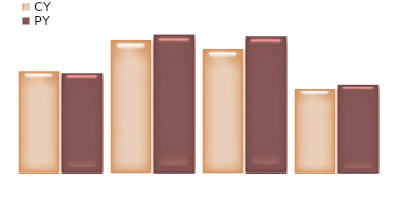
| Category | CY | PY |
|---|---|---|
| Road | 5596205.624 | 5484281.512 |
| Courier | 7299398.641 | 7591374.586 |
| Air | 6812772.065 | 7494049.271 |
| Mail | 4622952.472 | 4854100.096 |